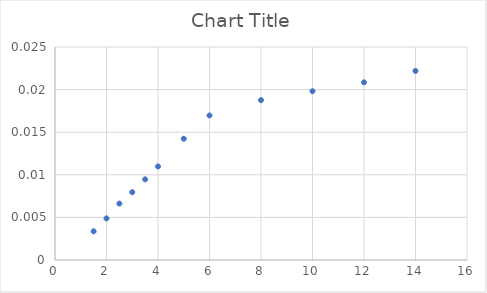
| Category | Series 0 |
|---|---|
| 1.5 | 0.003 |
| 2.0 | 0.005 |
| 2.5 | 0.007 |
| 3.0 | 0.008 |
| 3.5 | 0.009 |
| 4.0 | 0.011 |
| 5.0 | 0.014 |
| 6.0 | 0.017 |
| 8.0 | 0.019 |
| 10.0 | 0.02 |
| 12.0 | 0.021 |
| 14.0 | 0.022 |